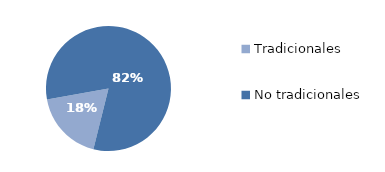
| Category | Series 0 |
|---|---|
| Tradicionales | 412.121 |
| No tradicionales | 1842.359 |